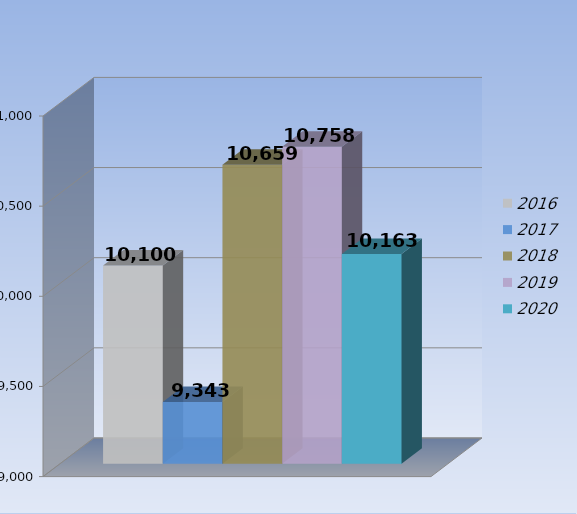
| Category | 2016 | 2017 | 2018 | 2019 | 2020 |
|---|---|---|---|---|---|
| 0 | 10100 | 9343 | 10659 | 10758 | 10163 |